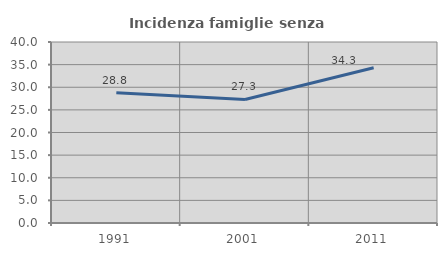
| Category | Incidenza famiglie senza nuclei |
|---|---|
| 1991.0 | 28.81 |
| 2001.0 | 27.31 |
| 2011.0 | 34.296 |